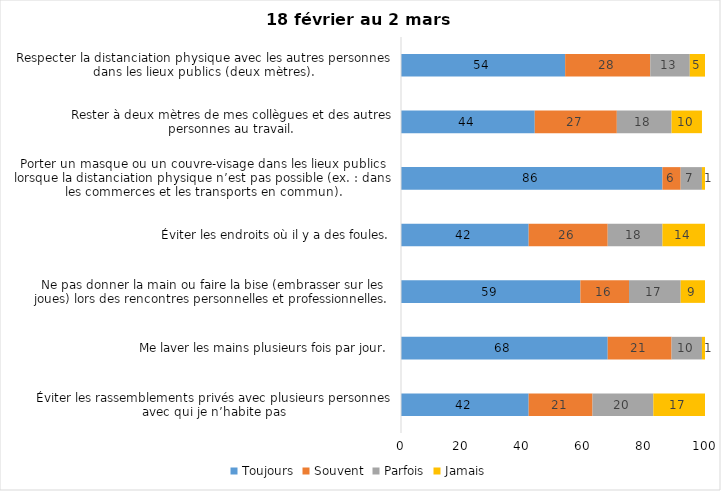
| Category | Toujours | Souvent | Parfois | Jamais |
|---|---|---|---|---|
| Éviter les rassemblements privés avec plusieurs personnes avec qui je n’habite pas | 42 | 21 | 20 | 17 |
| Me laver les mains plusieurs fois par jour. | 68 | 21 | 10 | 1 |
| Ne pas donner la main ou faire la bise (embrasser sur les joues) lors des rencontres personnelles et professionnelles. | 59 | 16 | 17 | 9 |
| Éviter les endroits où il y a des foules. | 42 | 26 | 18 | 14 |
| Porter un masque ou un couvre-visage dans les lieux publics lorsque la distanciation physique n’est pas possible (ex. : dans les commerces et les transports en commun). | 86 | 6 | 7 | 1 |
| Rester à deux mètres de mes collègues et des autres personnes au travail. | 44 | 27 | 18 | 10 |
| Respecter la distanciation physique avec les autres personnes dans les lieux publics (deux mètres). | 54 | 28 | 13 | 5 |